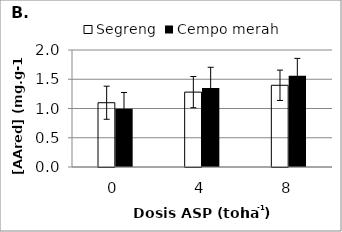
| Category | Segreng | Cempo merah |
|---|---|---|
| 0 | 1.099 | 0.996 |
| 1 | 1.28 | 1.351 |
| 2 | 1.397 | 1.558 |